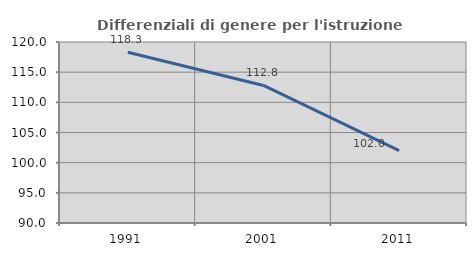
| Category | Differenziali di genere per l'istruzione superiore |
|---|---|
| 1991.0 | 118.308 |
| 2001.0 | 112.803 |
| 2011.0 | 102.009 |